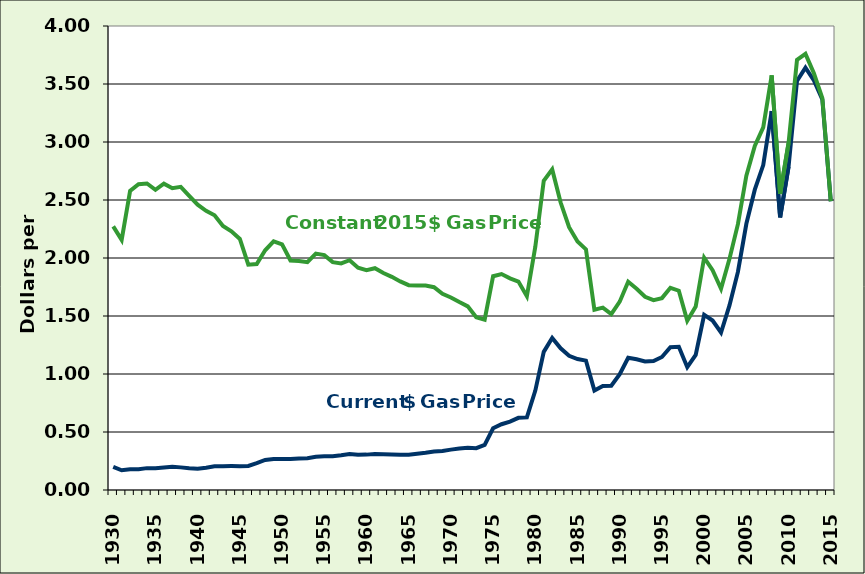
| Category | Series 0 | Series 1 |
|---|---|---|
| 1930.0 | 0.199 | 2.273 |
| 1931.0 | 0.17 | 2.156 |
| 1932.0 | 0.179 | 2.579 |
| 1933.0 | 0.178 | 2.636 |
| 1934.0 | 0.188 | 2.643 |
| 1935.0 | 0.188 | 2.588 |
| 1936.0 | 0.194 | 2.641 |
| 1937.0 | 0.2 | 2.602 |
| 1938.0 | 0.195 | 2.614 |
| 1939.0 | 0.188 | 2.536 |
| 1940.0 | 0.184 | 2.46 |
| 1941.0 | 0.192 | 2.407 |
| 1942.0 | 0.204 | 2.369 |
| 1943.0 | 0.205 | 2.277 |
| 1944.0 | 0.206 | 2.231 |
| 1945.0 | 0.205 | 2.165 |
| 1946.0 | 0.208 | 1.942 |
| 1947.0 | 0.231 | 1.948 |
| 1948.0 | 0.259 | 2.066 |
| 1949.0 | 0.268 | 2.143 |
| 1950.0 | 0.268 | 2.118 |
| 1951.0 | 0.268 | 1.978 |
| 1952.0 | 0.272 | 1.974 |
| 1953.0 | 0.274 | 1.964 |
| 1954.0 | 0.287 | 2.038 |
| 1955.0 | 0.29 | 2.025 |
| 1956.0 | 0.291 | 1.965 |
| 1957.0 | 0.299 | 1.954 |
| 1958.0 | 0.31 | 1.981 |
| 1959.0 | 0.304 | 1.916 |
| 1960.0 | 0.305 | 1.896 |
| 1961.0 | 0.311 | 1.912 |
| 1962.0 | 0.308 | 1.871 |
| 1963.0 | 0.306 | 1.838 |
| 1964.0 | 0.304 | 1.798 |
| 1965.0 | 0.304 | 1.766 |
| 1966.0 | 0.312 | 1.763 |
| 1967.0 | 0.321 | 1.762 |
| 1968.0 | 0.332 | 1.748 |
| 1969.0 | 0.337 | 1.692 |
| 1970.0 | 0.348 | 1.659 |
| 1971.0 | 0.357 | 1.62 |
| 1972.0 | 0.364 | 1.583 |
| 1973.0 | 0.361 | 1.489 |
| 1974.0 | 0.388 | 1.468 |
| 1975.0 | 0.532 | 1.843 |
| 1976.0 | 0.567 | 1.862 |
| 1977.0 | 0.59 | 1.824 |
| 1978.0 | 0.622 | 1.797 |
| 1979.0 | 0.626 | 1.671 |
| 1980.0 | 0.857 | 2.098 |
| 1981.0 | 1.191 | 2.666 |
| 1982.0 | 1.311 | 2.764 |
| 1983.0 | 1.222 | 2.478 |
| 1984.0 | 1.157 | 2.266 |
| 1985.0 | 1.129 | 2.143 |
| 1986.0 | 1.115 | 2.074 |
| 1987.0 | 0.857 | 1.555 |
| 1988.0 | 0.897 | 1.572 |
| 1989.0 | 0.899 | 1.517 |
| 1990.0 | 0.998 | 1.624 |
| 1991.0 | 1.14 | 1.795 |
| 1992.0 | 1.127 | 1.735 |
| 1993.0 | 1.108 | 1.666 |
| 1994.0 | 1.112 | 1.637 |
| 1995.0 | 1.147 | 1.654 |
| 1996.0 | 1.231 | 1.743 |
| 1997.0 | 1.234 | 1.718 |
| 1998.0 | 1.059 | 1.459 |
| 1999.0 | 1.165 | 1.581 |
| 2000.0 | 1.51 | 2.003 |
| 2001.0 | 1.461 | 1.895 |
| 2002.0 | 1.358 | 1.735 |
| 2003.0 | 1.591 | 1.993 |
| 2004.0 | 1.88 | 2.292 |
| 2005.0 | 2.295 | 2.71 |
| 2006.0 | 2.589 | 2.966 |
| 2007.0 | 2.801 | 3.126 |
| 2008.0 | 3.266 | 3.575 |
| 2009.0 | 2.35 | 2.553 |
| 2010.0 | 2.788 | 2.992 |
| 2011.0 | 3.527 | 3.709 |
| 2012.0 | 3.64 | 3.76 |
| 2013.0 | 3.53 | 3.593 |
| 2014.0 | 3.367 | 3.378 |
| 2015.0 | 2.489 | 2.489 |